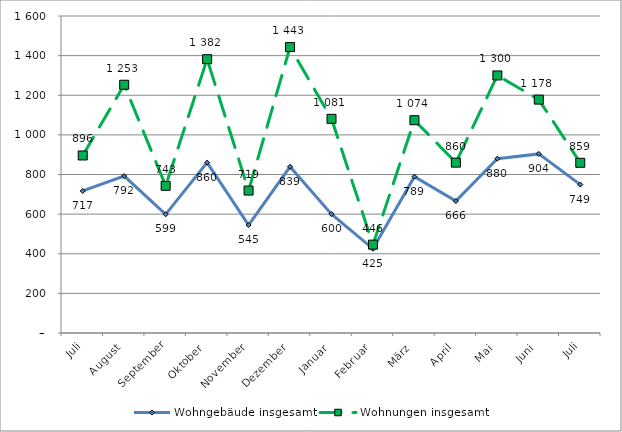
| Category | Wohngebäude insgesamt | Wohnungen insgesamt |
|---|---|---|
| Juli | 717 | 896 |
| August | 792 | 1253 |
| September | 599 | 743 |
| Oktober | 860 | 1382 |
| November | 545 | 719 |
| Dezember | 839 | 1443 |
| Januar | 600 | 1081 |
| Februar | 425 | 446 |
| März | 789 | 1074 |
| April | 666 | 860 |
| Mai | 880 | 1300 |
| Juni | 904 | 1178 |
| Juli | 749 | 859 |